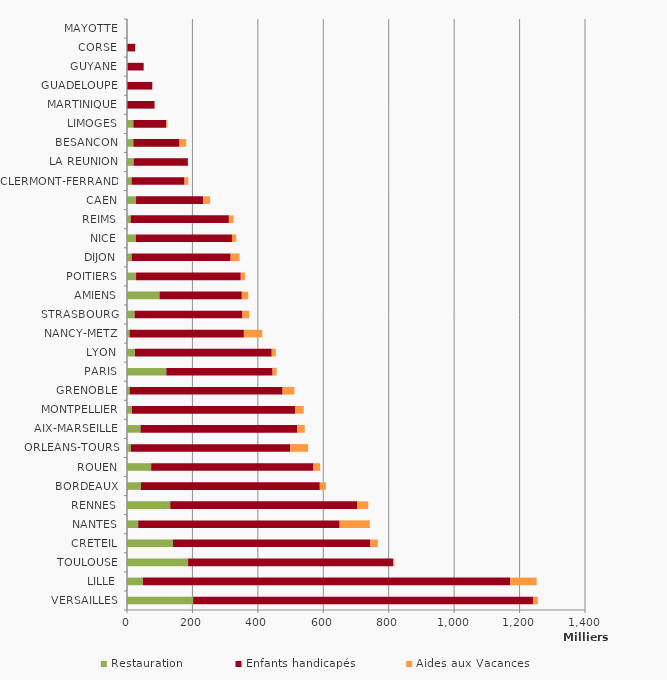
| Category | Restauration | Enfants handicapés | Aides aux Vacances |
|---|---|---|---|
| VERSAILLES | 202185 | 1039367 | 14146 |
| LILLE | 48658 | 1122701 | 80963 |
| TOULOUSE | 186760 | 626667 | 3649 |
| CRETEIL | 140725 | 603266 | 22795 |
| NANTES | 34198 | 615849 | 92232 |
| RENNES | 132140 | 572407 | 33074 |
| BORDEAUX | 42261 | 547128 | 18554 |
| ROUEN | 73864 | 496169 | 20386 |
| ORLEANS-TOURS | 11260 | 487842 | 54555 |
| AIX-MARSEILLE | 41351 | 478329 | 23554 |
| MONTPELLIER | 15172 | 499345 | 25243 |
| GRENOBLE | 8040 | 467635 | 35822 |
| PARIS | 120228 | 324883 | 12216 |
| LYON | 24368 | 418087 | 12455 |
| NANCY-METZ | 7954 | 349324 | 56347 |
| STRASBOURG | 23143 | 329720 | 20551 |
| AMIENS | 99399 | 251637 | 19631 |
| POITIERS | 27729 | 320005 | 12808 |
| DIJON | 14268 | 302580 | 26936 |
| NICE | 26913 | 293881 | 13270 |
| REIMS | 11330 | 300071 | 14454 |
| CAEN | 27643 | 204755 | 21309 |
| CLERMONT-FERRAND | 14173 | 161805 | 11480 |
| LA REUNION | 20359 | 165704 | 44 |
| BESANCON | 19472 | 141101 | 20470 |
| LIMOGES | 19441 | 100193 | 3998 |
| MARTINIQUE | 0 | 84513 | 1792 |
| GUADELOUPE | 0 | 77271 | 842 |
| GUYANE | 1732 | 49453 | 784 |
| CORSE | 0 | 25004 | 412 |
| MAYOTTE | 0 | 0 | 0 |